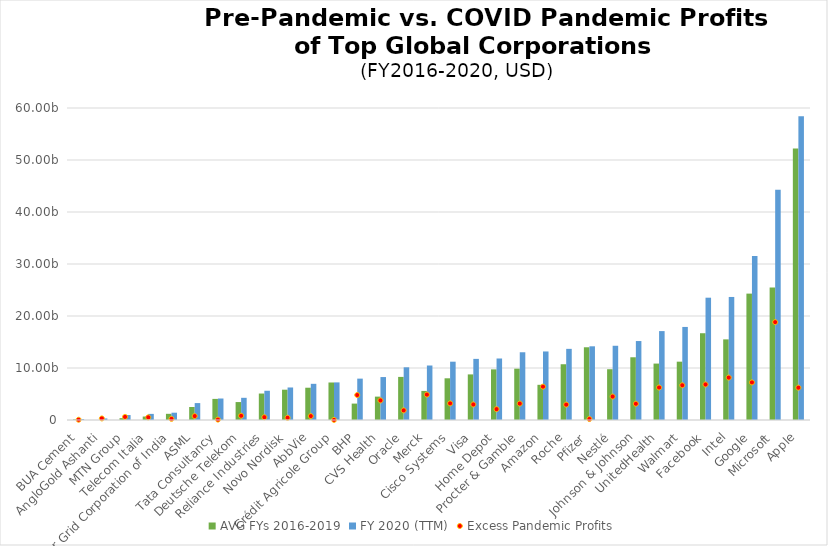
| Category | AVG FYs 2016-2019 | FY 2020 (TTM) |
|---|---|---|
| BUA Cement | 117366666.667 | 167300000 |
| AngloGold Ashanti | -1750000 | 295000000 |
| MTN Group | 353200000 | 951600000 |
| Telecom Italia | 666750000 | 1173800000 |
| Power Grid Corporation of India | 1189500000 | 1403900000 |
| ASML | 2500750000 | 3254000000 |
| Tata Consultancy | 4057600000 | 4132600000 |
| Deutsche Telekom | 3449825000 | 4267000000 |
| Reliance Industries | 5090050000 | 5624000000 |
| Novo Nordisk | 5827250000 | 6253700000 |
| AbbVie | 6207750000 | 6957000000 |
| Crédit Agricole Group | 7212900000 | 7231600000 |
| BHP | 3155000000 | 7956000000 |
| CVS Health | 4494750000 | 8259000000 |
| Oracle | 8286000000 | 10135000000 |
| Merck | 5594250000 | 10479000000 |
| Cisco Systems | 8019750000 | 11214000000 |
| Visa | 8767750000 | 11754000000 |
| Home Depot | 9737500000 | 11827000000 |
| Procter & Gamble | 9870250000 | 13027000000 |
| Amazon | 6766250000 | 13180000000 |
| Roche | 10723225000 | 13681000000 |
| Pfizer | 13987250000 | 14172000000 |
| Nestlé | 9765175000 | 14275800000 |
| Johnson & Johnson | 12064000000 | 15185000000 |
| UnitedHealth | 10850000000 | 17098000000 |
| Walmart | 11217250000 | 17895000000 |
| Facebook | 16687000000 | 23521000000 |
| Intel | 15504500000 | 23661000000 |
| Google | 24304750000 | 31534000000 |
| Microsoft | 25459750000 | 44281000000 |
| Apple | 52206250000 | 58424000000 |